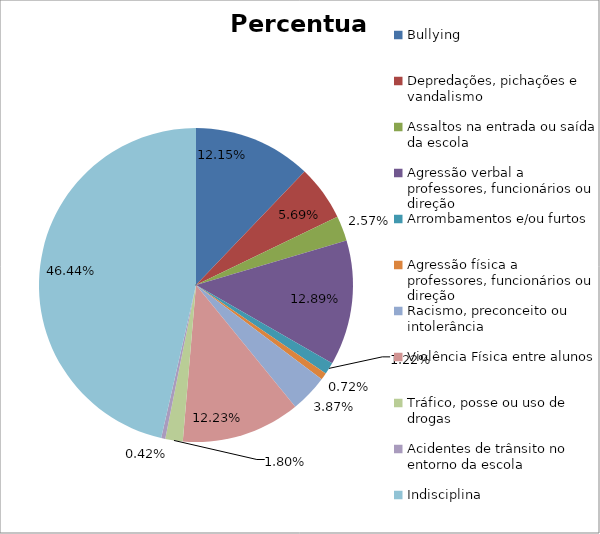
| Category | Percentual |
|---|---|
| Bullying | 0.122 |
| Depredações, pichações e vandalismo | 0.057 |
| Assaltos na entrada ou saída da escola | 0.026 |
| Agressão verbal a professores, funcionários ou direção | 0.129 |
| Arrombamentos e/ou furtos | 0.012 |
| Agressão física a professores, funcionários ou direção | 0.007 |
| Racismo, preconceito ou intolerância | 0.039 |
| Violência Física entre alunos | 0.122 |
| Tráfico, posse ou uso de drogas | 0.018 |
| Acidentes de trânsito no entorno da escola | 0.004 |
| Indisciplina | 0.464 |